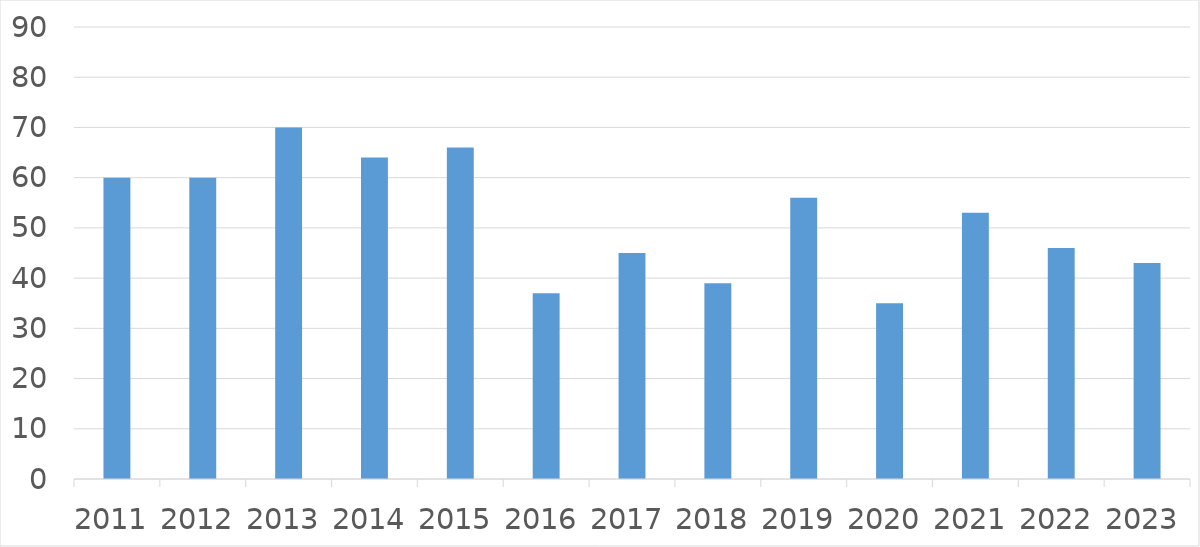
| Category | Series 0 |
|---|---|
| 2011 | 60 |
| 2012 | 60 |
| 2013 | 70 |
| 2014 | 64 |
| 2015 | 66 |
| 2016 | 37 |
| 2017 | 45 |
| 2018 | 39 |
| 2019 | 56 |
| 2020 | 35 |
| 2021 | 53 |
| 2022 | 46 |
| 2023 | 43 |